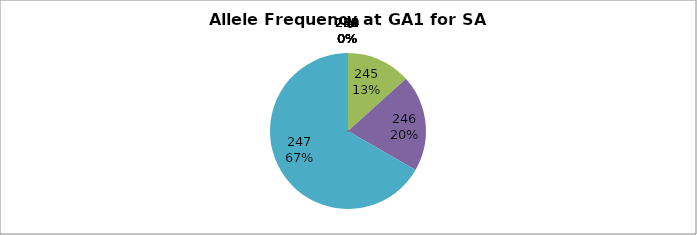
| Category | Series 0 |
|---|---|
| 221.0 | 0 |
| 238.0 | 0 |
| 239.0 | 0 |
| 240.0 | 0 |
| 241.0 | 0 |
| 242.0 | 0 |
| 243.0 | 0 |
| 244.0 | 0 |
| 245.0 | 0.133 |
| 246.0 | 0.2 |
| 247.0 | 0.667 |
| 248.0 | 0 |
| 249.0 | 0 |
| 250.0 | 0 |
| 251.0 | 0 |
| 253.0 | 0 |